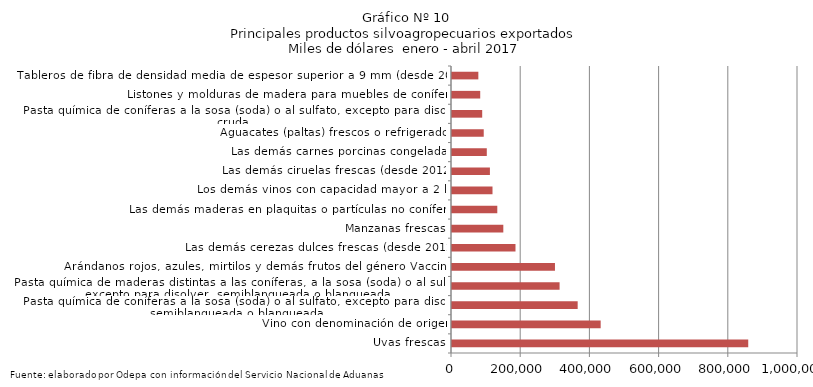
| Category | Series 0 |
|---|---|
| Uvas frescas | 856175.067 |
| Vino con denominación de origen | 429676.993 |
| Pasta química de coníferas a la sosa (soda) o al sulfato, excepto para disolver, semiblanqueada o blanqueada | 363204.542 |
| Pasta química de maderas distintas a las coníferas, a la sosa (soda) o al sulfato, excepto para disolver, semiblanqueada o blanqueada | 310932.757 |
| Arándanos rojos, azules, mirtilos y demás frutos del género Vaccinium | 297595.283 |
| Las demás cerezas dulces frescas (desde 2012) | 183499.541 |
| Manzanas frescas | 148303.104 |
| Las demás maderas en plaquitas o partículas no coníferas | 130896.989 |
| Los demás vinos con capacidad mayor a 2 lts | 117056.919 |
| Las demás ciruelas frescas (desde 2012) | 109574.517 |
| Las demás carnes porcinas congeladas | 100577.839 |
| Aguacates (paltas) frescos o refrigerados | 91710.409 |
| Pasta química de coníferas a la sosa (soda) o al sulfato, excepto para disolver, cruda | 87284.731 |
| Listones y molduras de madera para muebles de coníferas | 81554.164 |
| Tableros de fibra de densidad media de espesor superior a 9 mm (desde 2007) | 76135.467 |